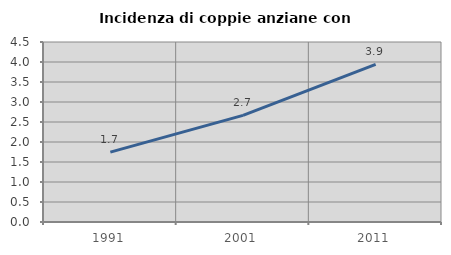
| Category | Incidenza di coppie anziane con figli |
|---|---|
| 1991.0 | 1.747 |
| 2001.0 | 2.666 |
| 2011.0 | 3.939 |